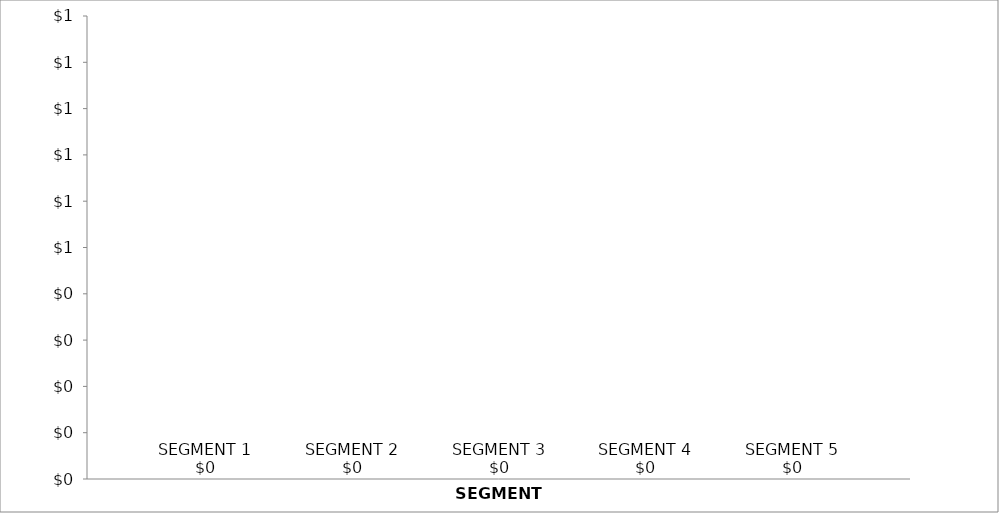
| Category | SEGMENT 1 | SEGMENT 2 | SEGMENT 3 | SEGMENT 4 | SEGMENT 5 |
|---|---|---|---|---|---|
| 0 | 0 | 0 | 0 | 0 | 0 |